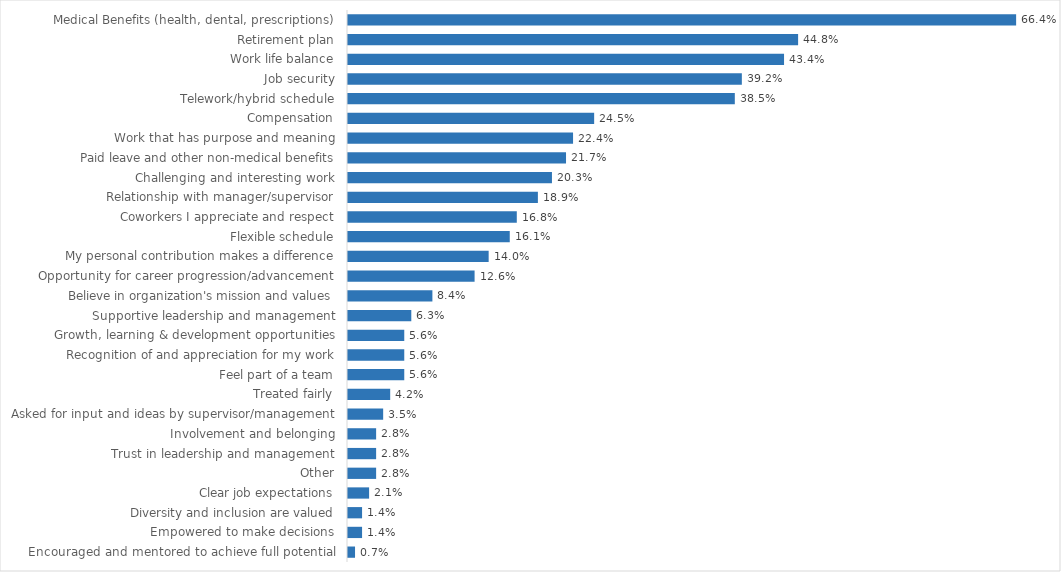
| Category | Taxes |
|---|---|
| Medical Benefits (health, dental, prescriptions) | 0.664 |
| Retirement plan | 0.448 |
| Work life balance | 0.434 |
| Job security | 0.392 |
| Telework/hybrid schedule | 0.385 |
| Compensation | 0.245 |
| Work that has purpose and meaning | 0.224 |
| Paid leave and other non-medical benefits | 0.217 |
| Challenging and interesting work | 0.203 |
| Relationship with manager/supervisor | 0.189 |
| Coworkers I appreciate and respect | 0.168 |
| Flexible schedule | 0.161 |
| My personal contribution makes a difference | 0.14 |
| Opportunity for career progression/advancement | 0.126 |
| Believe in organization's mission and values | 0.084 |
| Supportive leadership and management | 0.063 |
| Growth, learning & development opportunities | 0.056 |
| Recognition of and appreciation for my work | 0.056 |
| Feel part of a team | 0.056 |
| Treated fairly | 0.042 |
| Asked for input and ideas by supervisor/management | 0.035 |
| Involvement and belonging | 0.028 |
| Trust in leadership and management | 0.028 |
| Other | 0.028 |
| Clear job expectations | 0.021 |
| Diversity and inclusion are valued | 0.014 |
| Empowered to make decisions | 0.014 |
| Encouraged and mentored to achieve full potential | 0.007 |